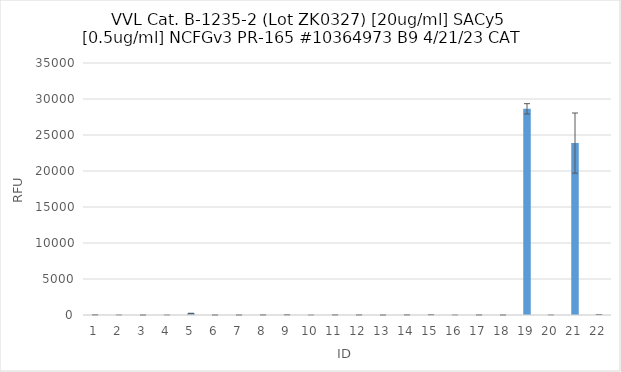
| Category | RFU |
|---|---|
| 0 | 25.25 |
| 1 | 3 |
| 2 | 0 |
| 3 | 1 |
| 4 | 224.5 |
| 5 | 3 |
| 6 | -0.25 |
| 7 | 15.75 |
| 8 | 32.5 |
| 9 | 0.25 |
| 10 | 19 |
| 11 | 11.25 |
| 12 | 0 |
| 13 | -16.25 |
| 14 | -27 |
| 15 | 2.75 |
| 16 | 7.75 |
| 17 | 2.75 |
| 18 | 28636 |
| 19 | 3 |
| 20 | 23875.5 |
| 21 | 65 |